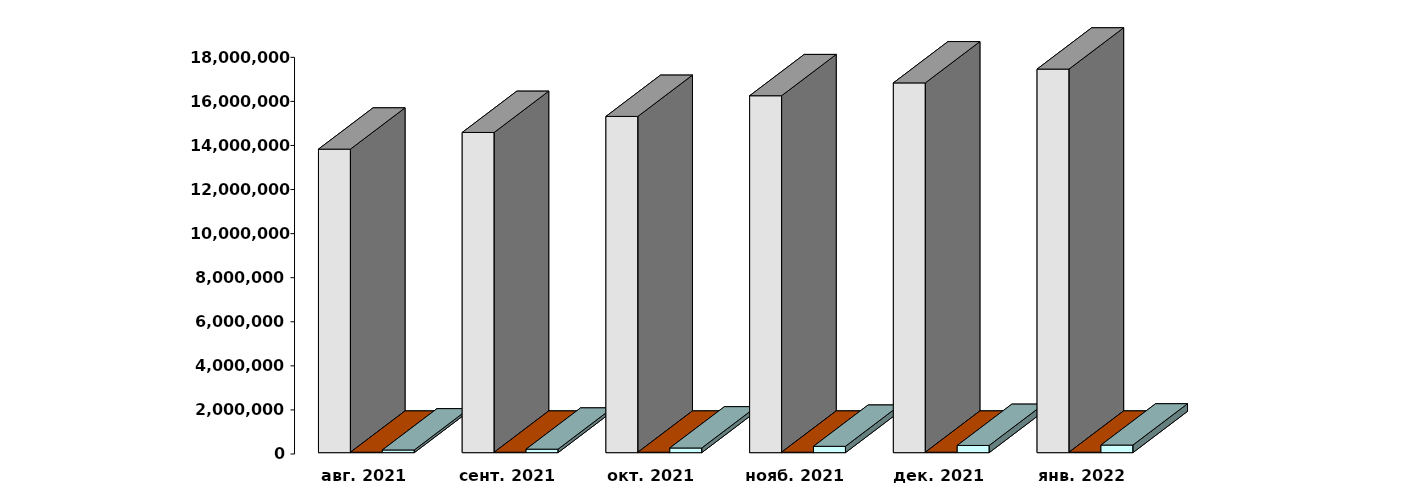
| Category | Физические лица | Юридические лица | Клиенты, передавшие свои средства в ДУ |
|---|---|---|---|
| 2021-08-30 | 13773190 | 19995 | 122307 |
| 2021-09-30 | 14530193 | 20081 | 158895 |
| 2021-10-30 | 15258509 | 20154 | 212008 |
| 2021-11-30 | 16196130 | 20272 | 288895 |
| 2021-12-31 | 16779069 | 20446 | 327432 |
| 2022-01-31 | 17405817 | 20536 | 345411 |